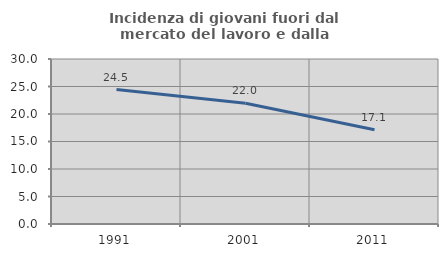
| Category | Incidenza di giovani fuori dal mercato del lavoro e dalla formazione  |
|---|---|
| 1991.0 | 24.454 |
| 2001.0 | 21.956 |
| 2011.0 | 17.128 |